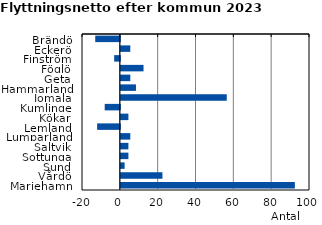
| Category | Series 0 |
|---|---|
| Brändö | -13 |
| Eckerö | 5 |
| Finström | -3 |
| Föglö | 12 |
| Geta | 5 |
| Hammarland | 8 |
| Jomala | 56 |
| Kumlinge | -8 |
| Kökar | 4 |
| Lemland | -12 |
| Lumparland | 5 |
| Saltvik | 4 |
| Sottunga | 4 |
| Sund | 2 |
| Vårdö | 22 |
| Mariehamn | 92 |